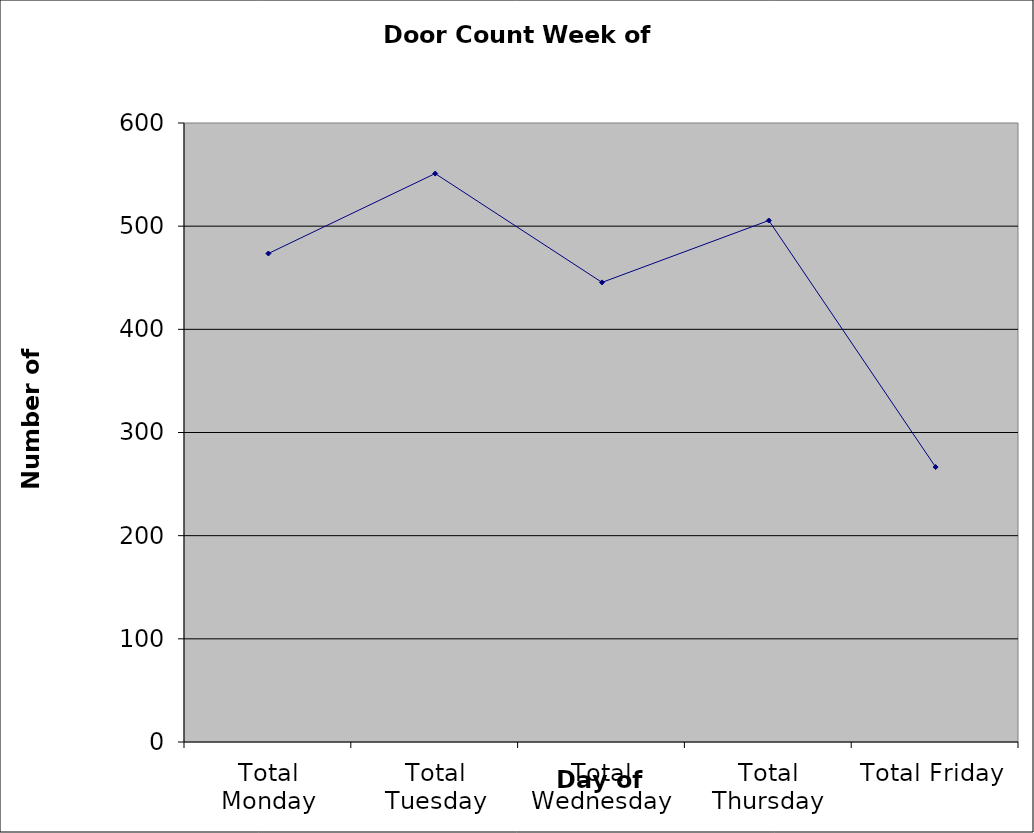
| Category | Series 0 |
|---|---|
| Total Monday | 473.5 |
| Total Tuesday | 551 |
| Total Wednesday | 445.5 |
| Total Thursday | 505.5 |
| Total Friday | 266.5 |